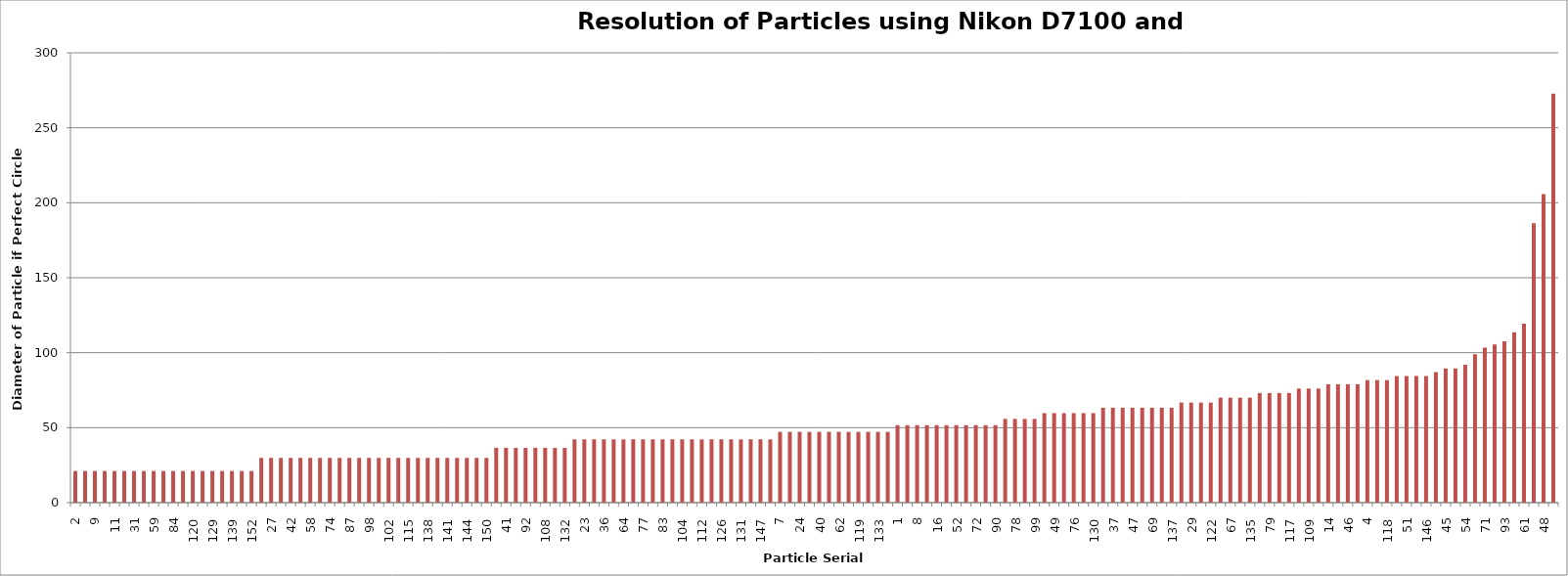
| Category | Matlab Diameter if Perfect Circle (um) |
|---|---|
| 2.0 | 21.11 |
| 6.0 | 21.11 |
| 9.0 | 21.11 |
| 10.0 | 21.11 |
| 11.0 | 21.11 |
| 17.0 | 21.11 |
| 31.0 | 21.11 |
| 33.0 | 21.11 |
| 59.0 | 21.11 |
| 65.0 | 21.11 |
| 84.0 | 21.11 |
| 111.0 | 21.11 |
| 120.0 | 21.11 |
| 121.0 | 21.11 |
| 129.0 | 21.11 |
| 134.0 | 21.11 |
| 139.0 | 21.11 |
| 142.0 | 21.11 |
| 152.0 | 21.11 |
| 13.0 | 29.854 |
| 27.0 | 29.854 |
| 39.0 | 29.854 |
| 42.0 | 29.854 |
| 55.0 | 29.854 |
| 58.0 | 29.854 |
| 70.0 | 29.854 |
| 74.0 | 29.854 |
| 80.0 | 29.854 |
| 87.0 | 29.854 |
| 91.0 | 29.854 |
| 98.0 | 29.854 |
| 100.0 | 29.854 |
| 102.0 | 29.854 |
| 106.0 | 29.854 |
| 115.0 | 29.854 |
| 123.0 | 29.854 |
| 138.0 | 29.854 |
| 140.0 | 29.854 |
| 141.0 | 29.854 |
| 143.0 | 29.854 |
| 144.0 | 29.854 |
| 148.0 | 29.854 |
| 150.0 | 29.854 |
| 28.0 | 36.564 |
| 41.0 | 36.564 |
| 89.0 | 36.564 |
| 92.0 | 36.564 |
| 96.0 | 36.564 |
| 108.0 | 36.564 |
| 114.0 | 36.564 |
| 132.0 | 36.564 |
| 21.0 | 42.22 |
| 23.0 | 42.22 |
| 25.0 | 42.22 |
| 36.0 | 42.22 |
| 60.0 | 42.22 |
| 64.0 | 42.22 |
| 73.0 | 42.22 |
| 77.0 | 42.22 |
| 82.0 | 42.22 |
| 83.0 | 42.22 |
| 85.0 | 42.22 |
| 104.0 | 42.22 |
| 110.0 | 42.22 |
| 112.0 | 42.22 |
| 113.0 | 42.22 |
| 126.0 | 42.22 |
| 127.0 | 42.22 |
| 131.0 | 42.22 |
| 145.0 | 42.22 |
| 147.0 | 42.22 |
| 151.0 | 42.22 |
| 7.0 | 47.204 |
| 15.0 | 47.204 |
| 24.0 | 47.204 |
| 35.0 | 47.204 |
| 40.0 | 47.204 |
| 56.0 | 47.204 |
| 62.0 | 47.204 |
| 95.0 | 47.204 |
| 119.0 | 47.204 |
| 125.0 | 47.204 |
| 133.0 | 47.204 |
| 136.0 | 47.204 |
| 1.0 | 51.709 |
| 3.0 | 51.709 |
| 8.0 | 51.709 |
| 12.0 | 51.709 |
| 16.0 | 51.709 |
| 20.0 | 51.709 |
| 52.0 | 51.709 |
| 66.0 | 51.709 |
| 72.0 | 51.709 |
| 75.0 | 51.709 |
| 90.0 | 51.709 |
| 22.0 | 55.852 |
| 78.0 | 55.852 |
| 81.0 | 55.852 |
| 99.0 | 55.852 |
| 19.0 | 59.708 |
| 49.0 | 59.708 |
| 53.0 | 59.708 |
| 76.0 | 59.708 |
| 86.0 | 59.708 |
| 130.0 | 59.708 |
| 34.0 | 63.33 |
| 37.0 | 63.33 |
| 38.0 | 63.33 |
| 47.0 | 63.33 |
| 57.0 | 63.33 |
| 69.0 | 63.33 |
| 103.0 | 63.33 |
| 137.0 | 63.33 |
| 18.0 | 66.756 |
| 29.0 | 66.756 |
| 50.0 | 66.756 |
| 122.0 | 66.756 |
| 44.0 | 70.014 |
| 67.0 | 70.014 |
| 124.0 | 70.014 |
| 135.0 | 70.014 |
| 26.0 | 73.128 |
| 79.0 | 73.128 |
| 94.0 | 73.128 |
| 117.0 | 73.128 |
| 63.0 | 76.114 |
| 109.0 | 76.114 |
| 128.0 | 76.114 |
| 14.0 | 78.987 |
| 32.0 | 78.987 |
| 46.0 | 78.987 |
| 116.0 | 78.987 |
| 4.0 | 81.759 |
| 88.0 | 81.759 |
| 118.0 | 81.759 |
| 5.0 | 84.441 |
| 51.0 | 84.441 |
| 105.0 | 84.441 |
| 146.0 | 84.441 |
| 68.0 | 87.039 |
| 45.0 | 89.563 |
| 97.0 | 89.563 |
| 54.0 | 92.017 |
| 30.0 | 99.015 |
| 71.0 | 103.418 |
| 149.0 | 105.551 |
| 93.0 | 107.641 |
| 107.0 | 113.682 |
| 61.0 | 119.417 |
| 101.0 | 186.44 |
| 48.0 | 205.756 |
| 43.0 | 272.803 |